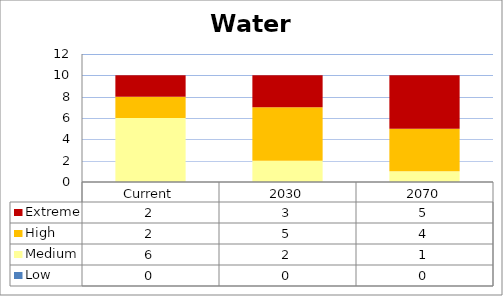
| Category | Low | Medium | High | Extreme |
|---|---|---|---|---|
| Current | 0 | 6 | 2 | 2 |
| 2030 | 0 | 2 | 5 | 3 |
| 2070 | 0 | 1 | 4 | 5 |